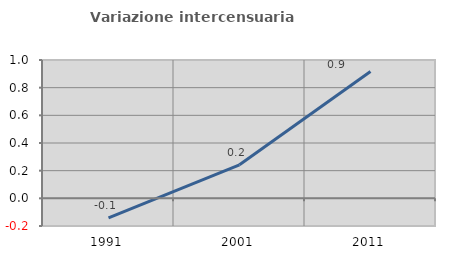
| Category | Variazione intercensuaria annua |
|---|---|
| 1991.0 | -0.141 |
| 2001.0 | 0.242 |
| 2011.0 | 0.917 |